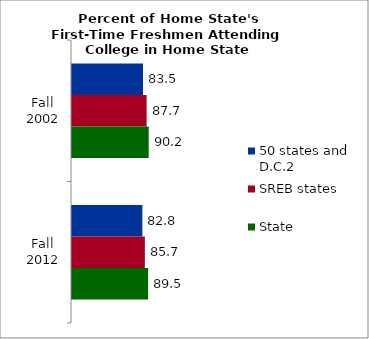
| Category | 50 states and D.C.2 | SREB states | State |
|---|---|---|---|
| Fall 2002 | 83.532 | 87.748 | 90.216 |
| Fall 2012 | 82.782 | 85.717 | 89.53 |